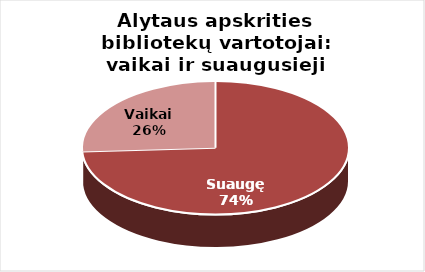
| Category | Series 0 |
|---|---|
| Suaugę | 18230 |
| Vaikai | 6374 |